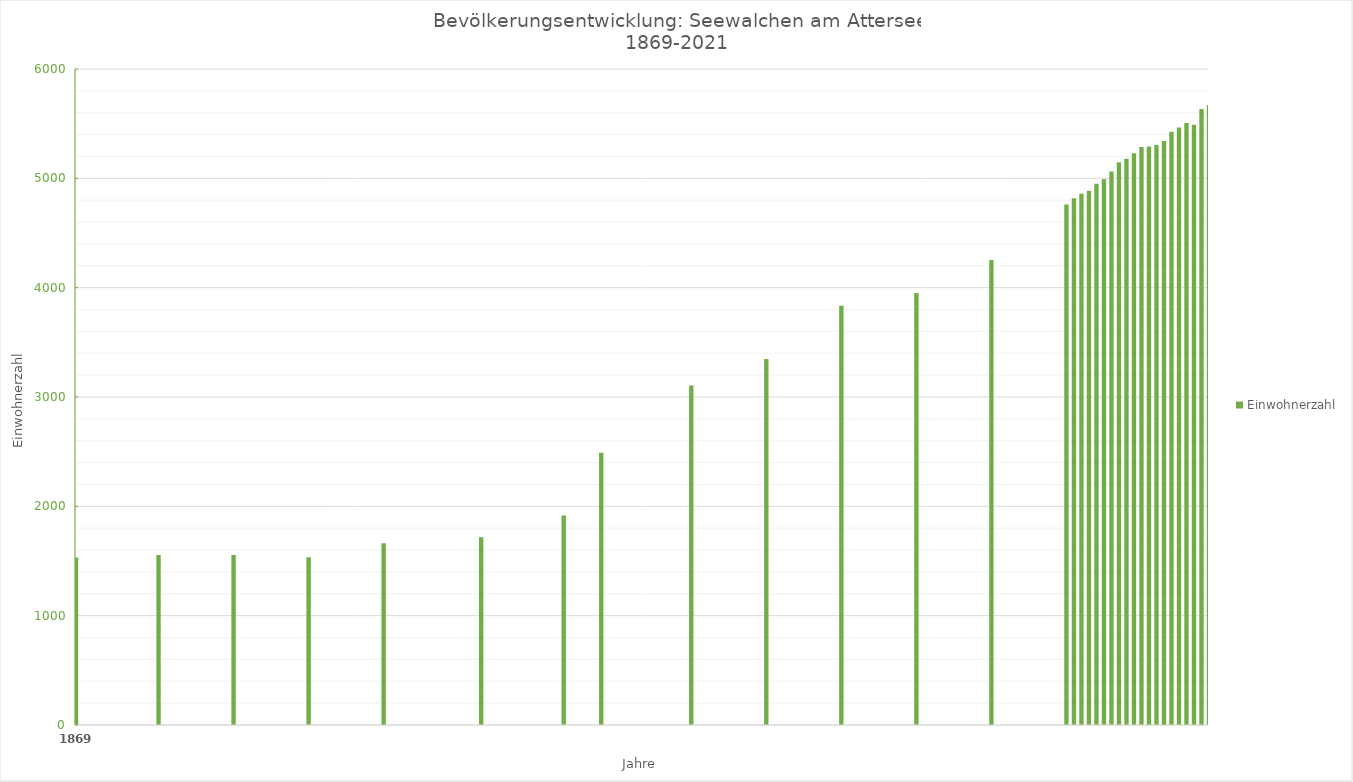
| Category | Einwohnerzahl |
|---|---|
| 1869.0 | 1532 |
| 1880.0 | 1556 |
| 1890.0 | 1555 |
| 1900.0 | 1535 |
| 1910.0 | 1663 |
| 1923.0 | 1718 |
| 1934.0 | 1916 |
| 1939.0 | 2491 |
| 1951.0 | 3105 |
| 1961.0 | 3347 |
| 1971.0 | 3835 |
| 1981.0 | 3951 |
| 1991.0 | 4253 |
| 2001.0 | 4761 |
| 2002.0 | 4818 |
| 2003.0 | 4860 |
| 2004.0 | 4887 |
| 2005.0 | 4951 |
| 2006.0 | 4991 |
| 2007.0 | 5063 |
| 2008.0 | 5147 |
| 2009.0 | 5178 |
| 2010.0 | 5229 |
| 2011.0 | 5286 |
| 2012.0 | 5292 |
| 2013.0 | 5306 |
| 2014.0 | 5341 |
| 2015.0 | 5426 |
| 2016.0 | 5464 |
| 2017.0 | 5506 |
| 2018.0 | 5491 |
| 2019.0 | 5635 |
| 2020.0 | 5669 |